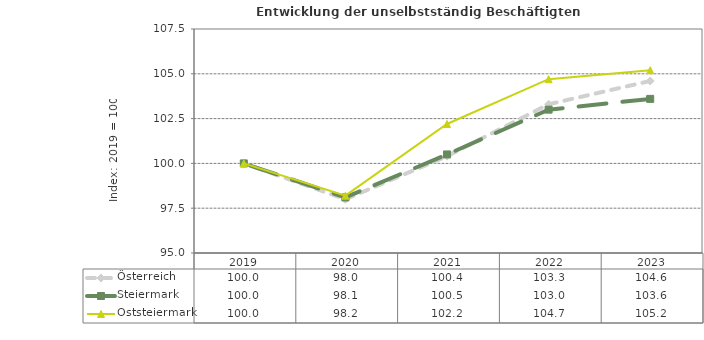
| Category | Österreich | Steiermark | Oststeiermark |
|---|---|---|---|
| 2023.0 | 104.6 | 103.6 | 105.2 |
| 2022.0 | 103.3 | 103 | 104.7 |
| 2021.0 | 100.4 | 100.5 | 102.2 |
| 2020.0 | 98 | 98.1 | 98.2 |
| 2019.0 | 100 | 100 | 100 |